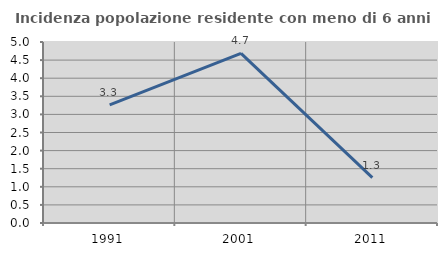
| Category | Incidenza popolazione residente con meno di 6 anni |
|---|---|
| 1991.0 | 3.264 |
| 2001.0 | 4.688 |
| 2011.0 | 1.253 |